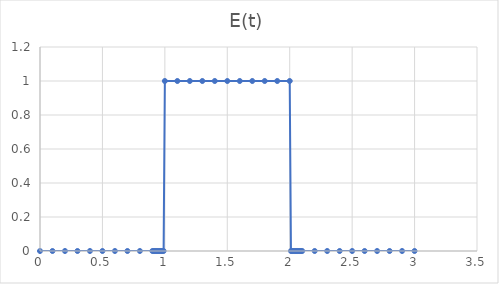
| Category | Series 0 |
|---|---|
| 0.0 | 0 |
| 0.1 | 0 |
| 0.2 | 0 |
| 0.3 | 0 |
| 0.4 | 0 |
| 0.5 | 0 |
| 0.6 | 0 |
| 0.7 | 0 |
| 0.8 | 0 |
| 0.9 | 0 |
| 0.91 | 0 |
| 0.92 | 0 |
| 0.93 | 0 |
| 0.94 | 0 |
| 0.95 | 0 |
| 0.96 | 0 |
| 0.97 | 0 |
| 0.98 | 0 |
| 0.99 | 0 |
| 1.0 | 1 |
| 1.1 | 1 |
| 1.2 | 1 |
| 1.3 | 1 |
| 1.4 | 1 |
| 1.5 | 1 |
| 1.6 | 1 |
| 1.7 | 1 |
| 1.8 | 1 |
| 1.9 | 1 |
| 2.0 | 1 |
| 2.01 | 0 |
| 2.02 | 0 |
| 2.03 | 0 |
| 2.04 | 0 |
| 2.05 | 0 |
| 2.06 | 0 |
| 2.07 | 0 |
| 2.08 | 0 |
| 2.09 | 0 |
| 2.1 | 0 |
| 2.2 | 0 |
| 2.3 | 0 |
| 2.4 | 0 |
| 2.5 | 0 |
| 2.6 | 0 |
| 2.7 | 0 |
| 2.8 | 0 |
| 2.9 | 0 |
| 3.0 | 0 |